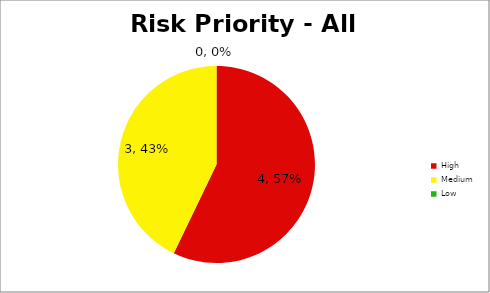
| Category | Count |
|---|---|
| High | 4 |
| Medium | 3 |
| Low | 0 |